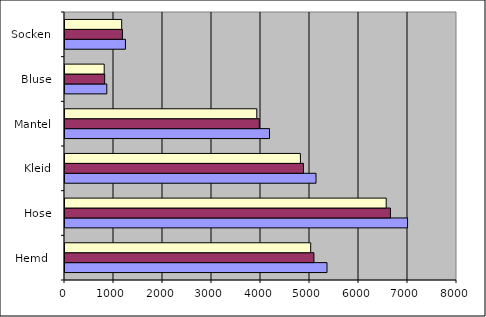
| Category | Series 0 | Series 1 | Series 2 |
|---|---|---|---|
| Hemd  | 5347 | 5080 | 5014 |
| Hose | 6991 | 6641 | 6555 |
| Kleid | 5123 | 4867 | 4804 |
| Mantel | 4174 | 3965 | 3914 |
| Bluse | 853 | 810 | 800 |
| Socken | 1234 | 1172 | 1157 |